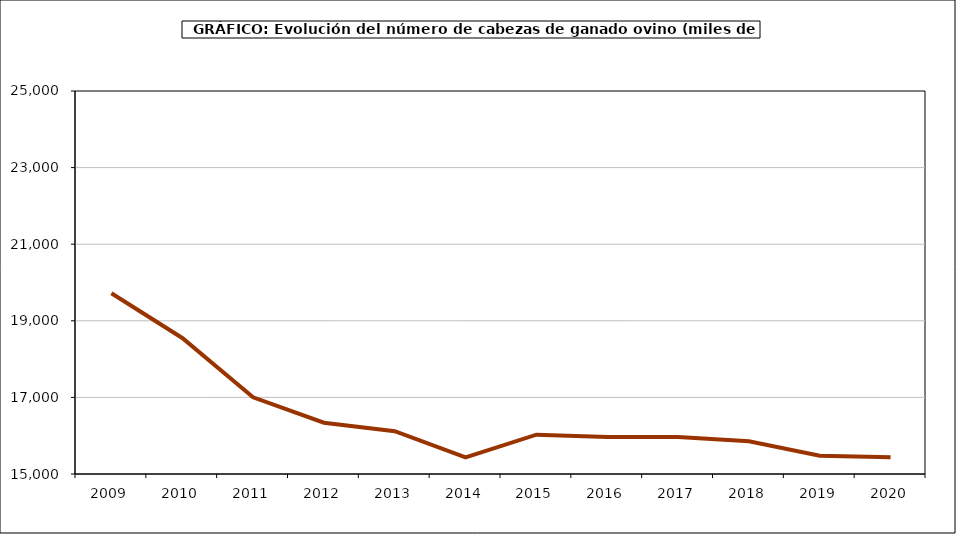
| Category | Series 0 |
|---|---|
| 2009.0 | 19718.195 |
| 2010.0 | 18552 |
| 2011.0 | 17003 |
| 2012.0 | 16339.373 |
| 2013.0 | 16118.586 |
| 2014.0 | 15431.804 |
| 2015.0 | 16026.374 |
| 2016.0 | 15962.892 |
| 2017.0 | 15963.106 |
| 2018.0 | 15852.525 |
| 2019.0 | 15478 |
| 2020.0 | 15440 |